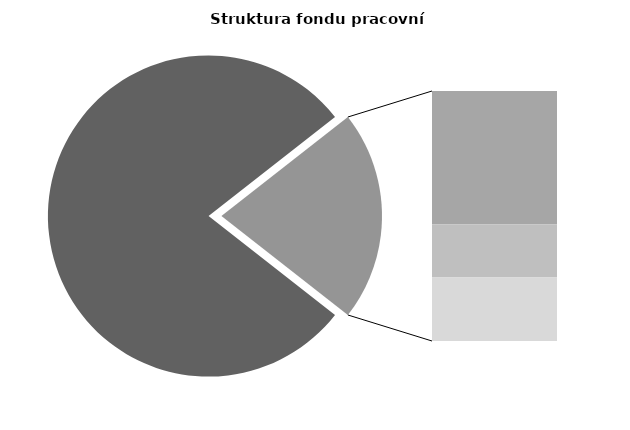
| Category | Series 0 |
|---|---|
| Průměrná měsíční odpracovaná doba bez přesčasu | 136.08 |
| Dovolená | 19.428 |
| Nemoc | 7.778 |
| Jiné | 9.276 |